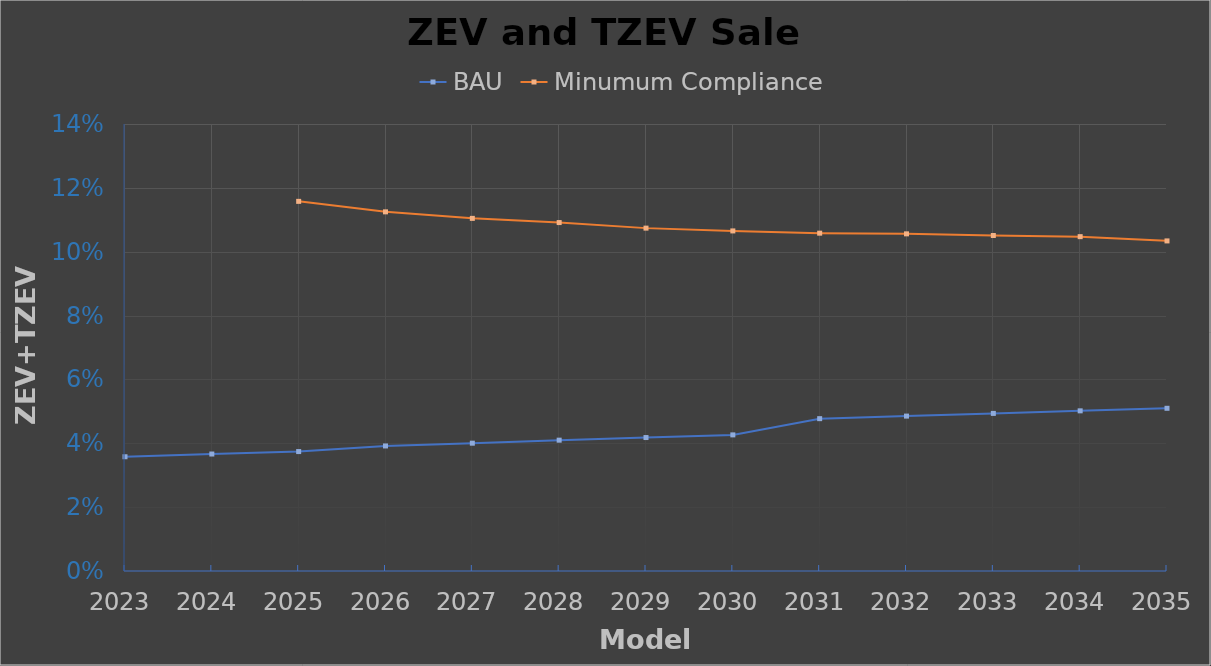
| Category | BAU | Minumum Compliance |
|---|---|---|
| 2023.0 | 0.036 | 0 |
| 2024.0 | 0.037 | 0 |
| 2025.0 | 0.037 | 0.116 |
| 2026.0 | 0.039 | 0.112 |
| 2027.0 | 0.04 | 0.11 |
| 2028.0 | 0.041 | 0.109 |
| 2029.0 | 0.042 | 0.107 |
| 2030.0 | 0.043 | 0.107 |
| 2031.0 | 0.048 | 0.106 |
| 2032.0 | 0.049 | 0.106 |
| 2033.0 | 0.049 | 0.105 |
| 2034.0 | 0.05 | 0.105 |
| 2035.0 | 0.051 | 0.103 |